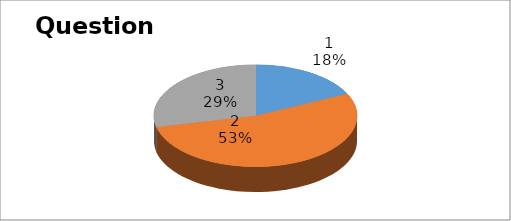
| Category | Series 0 |
|---|---|
| 0 | 10 |
| 1 | 30 |
| 2 | 16 |